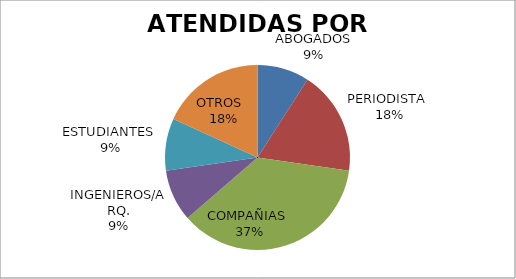
| Category | Series 0 |
|---|---|
| ABOGADOS | 1 |
| PERIODISTA  | 2 |
| COMPAÑIAS  | 4 |
| INGENIEROS/ARQ. | 1 |
| ESTUDIANTES  | 1 |
| OTROS   | 2 |